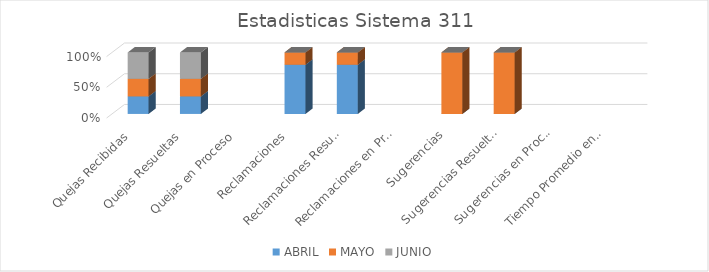
| Category | ABRIL | MAYO | JUNIO |
|---|---|---|---|
| Quejas Recibidas | 6 | 6 | 9 |
| Quejas Resueltas | 6 | 6 | 9 |
| Quejas en Proceso | 0 | 0 | 0 |
| Reclamaciones | 4 | 1 | 0 |
| Reclamaciones Resueltas | 4 | 1 | 0 |
| Reclamaciones en Proceso | 0 | 0 | 0 |
| Sugerencias | 0 | 1 | 0 |
| Sugerencias Resueltas | 0 | 1 | 0 |
| Sugerencias en Proceso | 0 | 0 | 0 |
| Tiempo Promedio en que fueron Respondidas | 0 | 0 | 0 |